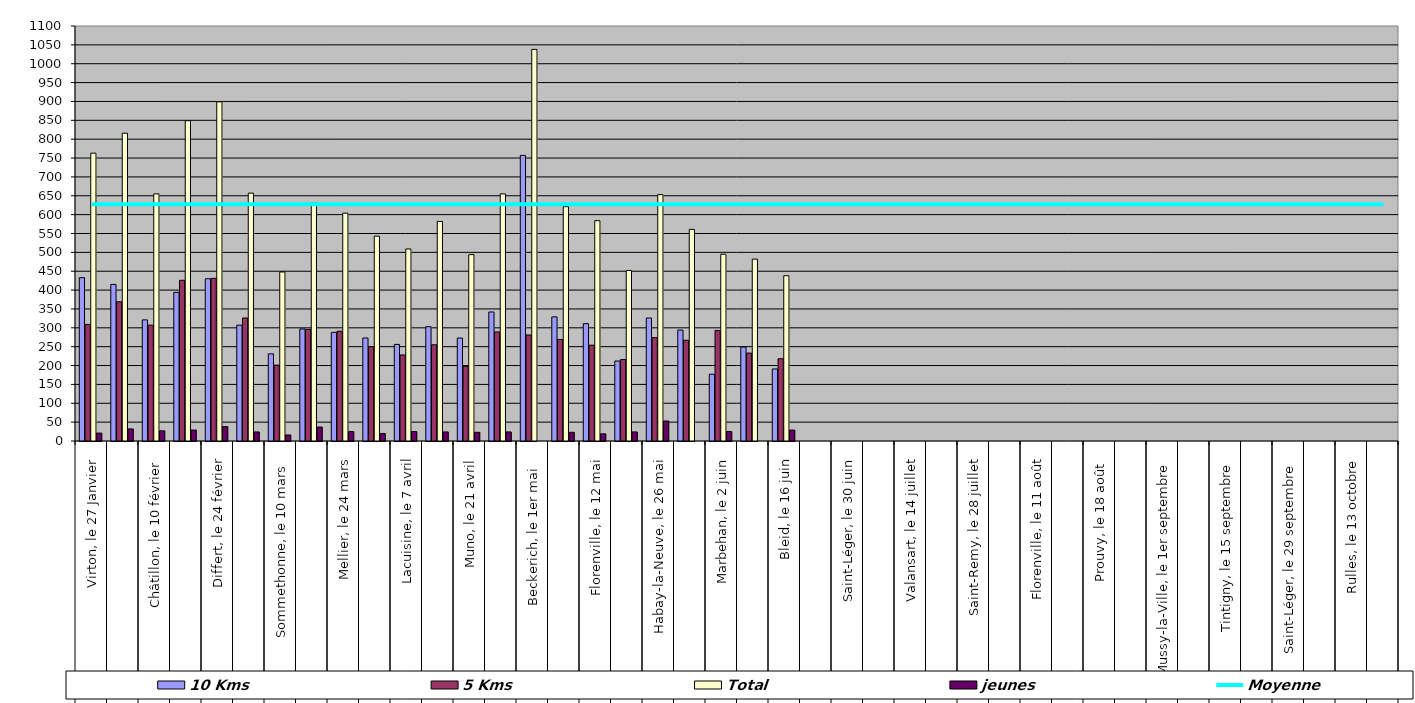
| Category | 10 Kms | 5 Kms | Total | jeunes |
|---|---|---|---|---|
| 0 | 433 | 309 | 763 | 21 |
| 1 | 415 | 369 | 816 | 32 |
| 2 | 321 | 307 | 655 | 27 |
| 3 | 394 | 426 | 849 | 29 |
| 4 | 430 | 431 | 899 | 38 |
| 5 | 307 | 326 | 657 | 24 |
| 6 | 231 | 201 | 448 | 16 |
| 7 | 297 | 296 | 630 | 37 |
| 8 | 288 | 291 | 604 | 25 |
| 9 | 273 | 250 | 543 | 20 |
| 10 | 256 | 228 | 509 | 25 |
| 11 | 303 | 255 | 582 | 24 |
| 12 | 273 | 198 | 494 | 23 |
| 13 | 342 | 289 | 655 | 24 |
| 14 | 757 | 281 | 1038 | 0 |
| 15 | 329 | 269 | 621 | 23 |
| 16 | 311 | 254 | 584 | 19 |
| 17 | 212 | 216 | 452 | 24 |
| 18 | 326 | 274 | 653 | 53 |
| 19 | 294 | 267 | 561 | 0 |
| 20 | 177 | 293 | 495 | 25 |
| 21 | 249 | 233 | 482 | 0 |
| 22 | 191 | 218 | 438 | 29 |
| 23 | 0 | 0 | 0 | 0 |
| 24 | 0 | 0 | 0 | 0 |
| 25 | 0 | 0 | 0 | 0 |
| 26 | 0 | 0 | 0 | 0 |
| 27 | 0 | 0 | 0 | 0 |
| 28 | 0 | 0 | 0 | 0 |
| 29 | 0 | 0 | 0 | 0 |
| 30 | 0 | 0 | 0 | 0 |
| 31 | 0 | 0 | 0 | 0 |
| 32 | 0 | 0 | 0 | 0 |
| 33 | 0 | 0 | 0 | 0 |
| 34 | 0 | 0 | 0 | 0 |
| 35 | 0 | 0 | 0 | 0 |
| 36 | 0 | 0 | 0 | 0 |
| 37 | 0 | 0 | 0 | 0 |
| 38 | 0 | 0 | 0 | 0 |
| 39 | 0 | 0 | 0 | 0 |
| 40 | 0 | 0 | 0 | 0 |
| 41 | 0 | 0 | 0 | 0 |